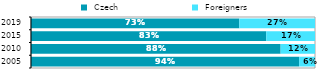
| Category |  Czech |  Foreigners |
|---|---|---|
| 2005.0 | 0.944 | 0.056 |
| 2010.0 | 0.879 | 0.121 |
| 2015.0 | 0.828 | 0.172 |
| 2019.0 | 0.733 | 0.267 |